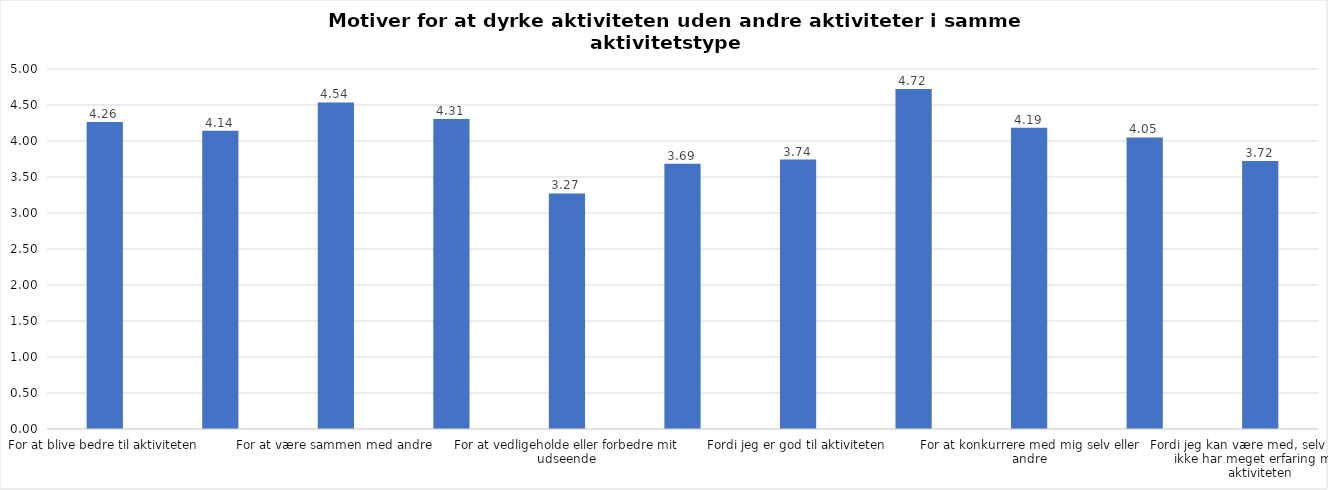
| Category | Gennemsnit |
|---|---|
| For at blive bedre til aktiviteten | 4.262 |
| For at vedligeholde eller forbedre min sundhed (fx helbred, fysisk form) | 4.143 |
| For at være sammen med andre | 4.536 |
| For at gøre noget godt for mig selv | 4.307 |
| For at vedligeholde eller forbedre mit udseende | 3.271 |
| Fordi andre i min omgangskreds opmuntrer mig til det | 3.686 |
| Fordi jeg er god til aktiviteten | 3.743 |
| Fordi jeg godt kan lide aktiviteten | 4.721 |
| For at konkurrere med mig selv eller andre | 4.186 |
| Fordi aktiviteten passer godt ind i min hverdag | 4.05 |
| Fordi jeg kan være med, selv om jeg ikke har meget erfaring med aktiviteten | 3.721 |